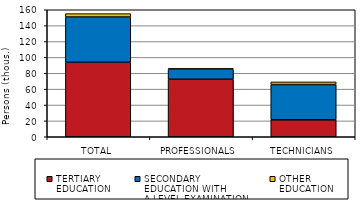
| Category | TERTIARY 
EDUCATION | SECONDARY 
EDUCATION WITH 
A-LEVEL EXAMINATION | OTHER 
EDUCATION |
|---|---|---|---|
| TOTAL | 93.823 | 57.012 | 4.268 |
| PROFESSIONALS | 72.455 | 12.644 | 0.907 |
| TECHNICIANS | 21.367 | 44.367 | 3.36 |